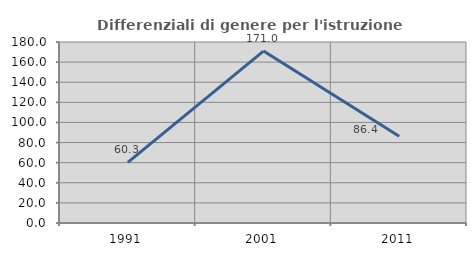
| Category | Differenziali di genere per l'istruzione superiore |
|---|---|
| 1991.0 | 60.297 |
| 2001.0 | 170.994 |
| 2011.0 | 86.364 |